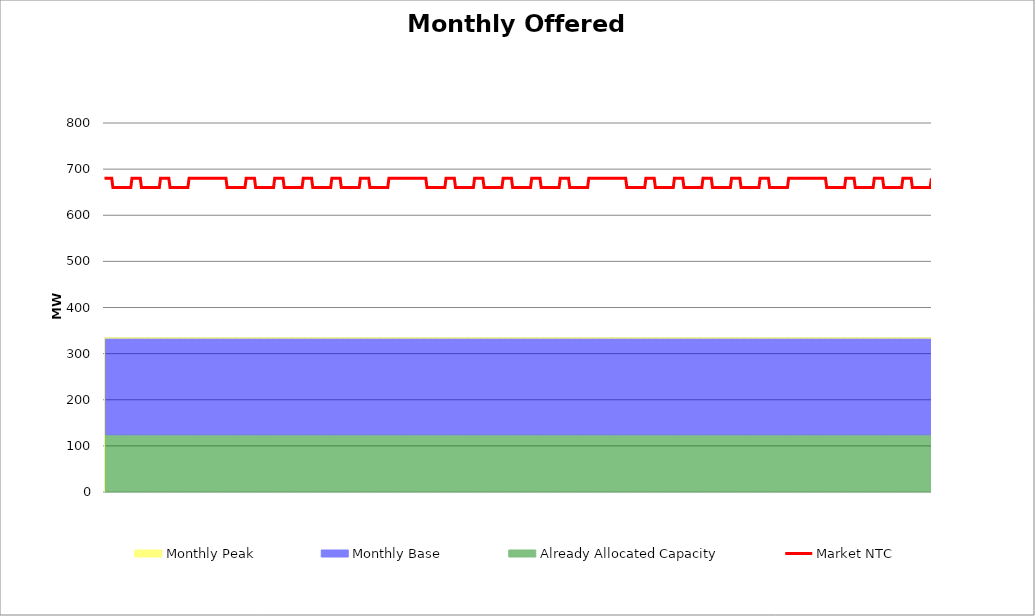
| Category | Market NTC |
|---|---|
| 0 | 680 |
| 1 | 680 |
| 2 | 680 |
| 3 | 680 |
| 4 | 680 |
| 5 | 680 |
| 6 | 680 |
| 7 | 660 |
| 8 | 660 |
| 9 | 660 |
| 10 | 660 |
| 11 | 660 |
| 12 | 660 |
| 13 | 660 |
| 14 | 660 |
| 15 | 660 |
| 16 | 660 |
| 17 | 660 |
| 18 | 660 |
| 19 | 660 |
| 20 | 660 |
| 21 | 660 |
| 22 | 660 |
| 23 | 680 |
| 24 | 680 |
| 25 | 680 |
| 26 | 680 |
| 27 | 680 |
| 28 | 680 |
| 29 | 680 |
| 30 | 680 |
| 31 | 660 |
| 32 | 660 |
| 33 | 660 |
| 34 | 660 |
| 35 | 660 |
| 36 | 660 |
| 37 | 660 |
| 38 | 660 |
| 39 | 660 |
| 40 | 660 |
| 41 | 660 |
| 42 | 660 |
| 43 | 660 |
| 44 | 660 |
| 45 | 660 |
| 46 | 660 |
| 47 | 680 |
| 48 | 680 |
| 49 | 680 |
| 50 | 680 |
| 51 | 680 |
| 52 | 680 |
| 53 | 680 |
| 54 | 680 |
| 55 | 660 |
| 56 | 660 |
| 57 | 660 |
| 58 | 660 |
| 59 | 660 |
| 60 | 660 |
| 61 | 660 |
| 62 | 660 |
| 63 | 660 |
| 64 | 660 |
| 65 | 660 |
| 66 | 660 |
| 67 | 660 |
| 68 | 660 |
| 69 | 660 |
| 70 | 660 |
| 71 | 680 |
| 72 | 680 |
| 73 | 680 |
| 74 | 680 |
| 75 | 680 |
| 76 | 680 |
| 77 | 680 |
| 78 | 680 |
| 79 | 680 |
| 80 | 680 |
| 81 | 680 |
| 82 | 680 |
| 83 | 680 |
| 84 | 680 |
| 85 | 680 |
| 86 | 680 |
| 87 | 680 |
| 88 | 680 |
| 89 | 680 |
| 90 | 680 |
| 91 | 680 |
| 92 | 680 |
| 93 | 680 |
| 94 | 680 |
| 95 | 680 |
| 96 | 680 |
| 97 | 680 |
| 98 | 680 |
| 99 | 680 |
| 100 | 680 |
| 101 | 680 |
| 102 | 680 |
| 103 | 660 |
| 104 | 660 |
| 105 | 660 |
| 106 | 660 |
| 107 | 660 |
| 108 | 660 |
| 109 | 660 |
| 110 | 660 |
| 111 | 660 |
| 112 | 660 |
| 113 | 660 |
| 114 | 660 |
| 115 | 660 |
| 116 | 660 |
| 117 | 660 |
| 118 | 660 |
| 119 | 680 |
| 120 | 680 |
| 121 | 680 |
| 122 | 680 |
| 123 | 680 |
| 124 | 680 |
| 125 | 680 |
| 126 | 680 |
| 127 | 660 |
| 128 | 660 |
| 129 | 660 |
| 130 | 660 |
| 131 | 660 |
| 132 | 660 |
| 133 | 660 |
| 134 | 660 |
| 135 | 660 |
| 136 | 660 |
| 137 | 660 |
| 138 | 660 |
| 139 | 660 |
| 140 | 660 |
| 141 | 660 |
| 142 | 660 |
| 143 | 680 |
| 144 | 680 |
| 145 | 680 |
| 146 | 680 |
| 147 | 680 |
| 148 | 680 |
| 149 | 680 |
| 150 | 680 |
| 151 | 660 |
| 152 | 660 |
| 153 | 660 |
| 154 | 660 |
| 155 | 660 |
| 156 | 660 |
| 157 | 660 |
| 158 | 660 |
| 159 | 660 |
| 160 | 660 |
| 161 | 660 |
| 162 | 660 |
| 163 | 660 |
| 164 | 660 |
| 165 | 660 |
| 166 | 660 |
| 167 | 680 |
| 168 | 680 |
| 169 | 680 |
| 170 | 680 |
| 171 | 680 |
| 172 | 680 |
| 173 | 680 |
| 174 | 680 |
| 175 | 660 |
| 176 | 660 |
| 177 | 660 |
| 178 | 660 |
| 179 | 660 |
| 180 | 660 |
| 181 | 660 |
| 182 | 660 |
| 183 | 660 |
| 184 | 660 |
| 185 | 660 |
| 186 | 660 |
| 187 | 660 |
| 188 | 660 |
| 189 | 660 |
| 190 | 660 |
| 191 | 680 |
| 192 | 680 |
| 193 | 680 |
| 194 | 680 |
| 195 | 680 |
| 196 | 680 |
| 197 | 680 |
| 198 | 680 |
| 199 | 660 |
| 200 | 660 |
| 201 | 660 |
| 202 | 660 |
| 203 | 660 |
| 204 | 660 |
| 205 | 660 |
| 206 | 660 |
| 207 | 660 |
| 208 | 660 |
| 209 | 660 |
| 210 | 660 |
| 211 | 660 |
| 212 | 660 |
| 213 | 660 |
| 214 | 660 |
| 215 | 680 |
| 216 | 680 |
| 217 | 680 |
| 218 | 680 |
| 219 | 680 |
| 220 | 680 |
| 221 | 680 |
| 222 | 680 |
| 223 | 660 |
| 224 | 660 |
| 225 | 660 |
| 226 | 660 |
| 227 | 660 |
| 228 | 660 |
| 229 | 660 |
| 230 | 660 |
| 231 | 660 |
| 232 | 660 |
| 233 | 660 |
| 234 | 660 |
| 235 | 660 |
| 236 | 660 |
| 237 | 660 |
| 238 | 660 |
| 239 | 680 |
| 240 | 680 |
| 241 | 680 |
| 242 | 680 |
| 243 | 680 |
| 244 | 680 |
| 245 | 680 |
| 246 | 680 |
| 247 | 680 |
| 248 | 680 |
| 249 | 680 |
| 250 | 680 |
| 251 | 680 |
| 252 | 680 |
| 253 | 680 |
| 254 | 680 |
| 255 | 680 |
| 256 | 680 |
| 257 | 680 |
| 258 | 680 |
| 259 | 680 |
| 260 | 680 |
| 261 | 680 |
| 262 | 680 |
| 263 | 680 |
| 264 | 680 |
| 265 | 680 |
| 266 | 680 |
| 267 | 680 |
| 268 | 680 |
| 269 | 680 |
| 270 | 680 |
| 271 | 660 |
| 272 | 660 |
| 273 | 660 |
| 274 | 660 |
| 275 | 660 |
| 276 | 660 |
| 277 | 660 |
| 278 | 660 |
| 279 | 660 |
| 280 | 660 |
| 281 | 660 |
| 282 | 660 |
| 283 | 660 |
| 284 | 660 |
| 285 | 660 |
| 286 | 660 |
| 287 | 680 |
| 288 | 680 |
| 289 | 680 |
| 290 | 680 |
| 291 | 680 |
| 292 | 680 |
| 293 | 680 |
| 294 | 680 |
| 295 | 660 |
| 296 | 660 |
| 297 | 660 |
| 298 | 660 |
| 299 | 660 |
| 300 | 660 |
| 301 | 660 |
| 302 | 660 |
| 303 | 660 |
| 304 | 660 |
| 305 | 660 |
| 306 | 660 |
| 307 | 660 |
| 308 | 660 |
| 309 | 660 |
| 310 | 660 |
| 311 | 680 |
| 312 | 680 |
| 313 | 680 |
| 314 | 680 |
| 315 | 680 |
| 316 | 680 |
| 317 | 680 |
| 318 | 680 |
| 319 | 660 |
| 320 | 660 |
| 321 | 660 |
| 322 | 660 |
| 323 | 660 |
| 324 | 660 |
| 325 | 660 |
| 326 | 660 |
| 327 | 660 |
| 328 | 660 |
| 329 | 660 |
| 330 | 660 |
| 331 | 660 |
| 332 | 660 |
| 333 | 660 |
| 334 | 660 |
| 335 | 680 |
| 336 | 680 |
| 337 | 680 |
| 338 | 680 |
| 339 | 680 |
| 340 | 680 |
| 341 | 680 |
| 342 | 680 |
| 343 | 660 |
| 344 | 660 |
| 345 | 660 |
| 346 | 660 |
| 347 | 660 |
| 348 | 660 |
| 349 | 660 |
| 350 | 660 |
| 351 | 660 |
| 352 | 660 |
| 353 | 660 |
| 354 | 660 |
| 355 | 660 |
| 356 | 660 |
| 357 | 660 |
| 358 | 660 |
| 359 | 680 |
| 360 | 680 |
| 361 | 680 |
| 362 | 680 |
| 363 | 680 |
| 364 | 680 |
| 365 | 680 |
| 366 | 680 |
| 367 | 660 |
| 368 | 660 |
| 369 | 660 |
| 370 | 660 |
| 371 | 660 |
| 372 | 660 |
| 373 | 660 |
| 374 | 660 |
| 375 | 660 |
| 376 | 660 |
| 377 | 660 |
| 378 | 660 |
| 379 | 660 |
| 380 | 660 |
| 381 | 660 |
| 382 | 660 |
| 383 | 680 |
| 384 | 680 |
| 385 | 680 |
| 386 | 680 |
| 387 | 680 |
| 388 | 680 |
| 389 | 680 |
| 390 | 680 |
| 391 | 660 |
| 392 | 660 |
| 393 | 660 |
| 394 | 660 |
| 395 | 660 |
| 396 | 660 |
| 397 | 660 |
| 398 | 660 |
| 399 | 660 |
| 400 | 660 |
| 401 | 660 |
| 402 | 660 |
| 403 | 660 |
| 404 | 660 |
| 405 | 660 |
| 406 | 660 |
| 407 | 680 |
| 408 | 680 |
| 409 | 680 |
| 410 | 680 |
| 411 | 680 |
| 412 | 680 |
| 413 | 680 |
| 414 | 680 |
| 415 | 680 |
| 416 | 680 |
| 417 | 680 |
| 418 | 680 |
| 419 | 680 |
| 420 | 680 |
| 421 | 680 |
| 422 | 680 |
| 423 | 680 |
| 424 | 680 |
| 425 | 680 |
| 426 | 680 |
| 427 | 680 |
| 428 | 680 |
| 429 | 680 |
| 430 | 680 |
| 431 | 680 |
| 432 | 680 |
| 433 | 680 |
| 434 | 680 |
| 435 | 680 |
| 436 | 680 |
| 437 | 680 |
| 438 | 680 |
| 439 | 660 |
| 440 | 660 |
| 441 | 660 |
| 442 | 660 |
| 443 | 660 |
| 444 | 660 |
| 445 | 660 |
| 446 | 660 |
| 447 | 660 |
| 448 | 660 |
| 449 | 660 |
| 450 | 660 |
| 451 | 660 |
| 452 | 660 |
| 453 | 660 |
| 454 | 660 |
| 455 | 680 |
| 456 | 680 |
| 457 | 680 |
| 458 | 680 |
| 459 | 680 |
| 460 | 680 |
| 461 | 680 |
| 462 | 680 |
| 463 | 660 |
| 464 | 660 |
| 465 | 660 |
| 466 | 660 |
| 467 | 660 |
| 468 | 660 |
| 469 | 660 |
| 470 | 660 |
| 471 | 660 |
| 472 | 660 |
| 473 | 660 |
| 474 | 660 |
| 475 | 660 |
| 476 | 660 |
| 477 | 660 |
| 478 | 660 |
| 479 | 680 |
| 480 | 680 |
| 481 | 680 |
| 482 | 680 |
| 483 | 680 |
| 484 | 680 |
| 485 | 680 |
| 486 | 680 |
| 487 | 660 |
| 488 | 660 |
| 489 | 660 |
| 490 | 660 |
| 491 | 660 |
| 492 | 660 |
| 493 | 660 |
| 494 | 660 |
| 495 | 660 |
| 496 | 660 |
| 497 | 660 |
| 498 | 660 |
| 499 | 660 |
| 500 | 660 |
| 501 | 660 |
| 502 | 660 |
| 503 | 680 |
| 504 | 680 |
| 505 | 680 |
| 506 | 680 |
| 507 | 680 |
| 508 | 680 |
| 509 | 680 |
| 510 | 680 |
| 511 | 660 |
| 512 | 660 |
| 513 | 660 |
| 514 | 660 |
| 515 | 660 |
| 516 | 660 |
| 517 | 660 |
| 518 | 660 |
| 519 | 660 |
| 520 | 660 |
| 521 | 660 |
| 522 | 660 |
| 523 | 660 |
| 524 | 660 |
| 525 | 660 |
| 526 | 660 |
| 527 | 680 |
| 528 | 680 |
| 529 | 680 |
| 530 | 680 |
| 531 | 680 |
| 532 | 680 |
| 533 | 680 |
| 534 | 680 |
| 535 | 660 |
| 536 | 660 |
| 537 | 660 |
| 538 | 660 |
| 539 | 660 |
| 540 | 660 |
| 541 | 660 |
| 542 | 660 |
| 543 | 660 |
| 544 | 660 |
| 545 | 660 |
| 546 | 660 |
| 547 | 660 |
| 548 | 660 |
| 549 | 660 |
| 550 | 660 |
| 551 | 680 |
| 552 | 680 |
| 553 | 680 |
| 554 | 680 |
| 555 | 680 |
| 556 | 680 |
| 557 | 680 |
| 558 | 680 |
| 559 | 660 |
| 560 | 660 |
| 561 | 660 |
| 562 | 660 |
| 563 | 660 |
| 564 | 660 |
| 565 | 660 |
| 566 | 660 |
| 567 | 660 |
| 568 | 660 |
| 569 | 660 |
| 570 | 660 |
| 571 | 660 |
| 572 | 660 |
| 573 | 660 |
| 574 | 660 |
| 575 | 680 |
| 576 | 680 |
| 577 | 680 |
| 578 | 680 |
| 579 | 680 |
| 580 | 680 |
| 581 | 680 |
| 582 | 680 |
| 583 | 680 |
| 584 | 680 |
| 585 | 680 |
| 586 | 680 |
| 587 | 680 |
| 588 | 680 |
| 589 | 680 |
| 590 | 680 |
| 591 | 680 |
| 592 | 680 |
| 593 | 680 |
| 594 | 680 |
| 595 | 680 |
| 596 | 680 |
| 597 | 680 |
| 598 | 680 |
| 599 | 680 |
| 600 | 680 |
| 601 | 680 |
| 602 | 680 |
| 603 | 680 |
| 604 | 680 |
| 605 | 680 |
| 606 | 680 |
| 607 | 660 |
| 608 | 660 |
| 609 | 660 |
| 610 | 660 |
| 611 | 660 |
| 612 | 660 |
| 613 | 660 |
| 614 | 660 |
| 615 | 660 |
| 616 | 660 |
| 617 | 660 |
| 618 | 660 |
| 619 | 660 |
| 620 | 660 |
| 621 | 660 |
| 622 | 660 |
| 623 | 680 |
| 624 | 680 |
| 625 | 680 |
| 626 | 680 |
| 627 | 680 |
| 628 | 680 |
| 629 | 680 |
| 630 | 680 |
| 631 | 660 |
| 632 | 660 |
| 633 | 660 |
| 634 | 660 |
| 635 | 660 |
| 636 | 660 |
| 637 | 660 |
| 638 | 660 |
| 639 | 660 |
| 640 | 660 |
| 641 | 660 |
| 642 | 660 |
| 643 | 660 |
| 644 | 660 |
| 645 | 660 |
| 646 | 660 |
| 647 | 680 |
| 648 | 680 |
| 649 | 680 |
| 650 | 680 |
| 651 | 680 |
| 652 | 680 |
| 653 | 680 |
| 654 | 680 |
| 655 | 660 |
| 656 | 660 |
| 657 | 660 |
| 658 | 660 |
| 659 | 660 |
| 660 | 660 |
| 661 | 660 |
| 662 | 660 |
| 663 | 660 |
| 664 | 660 |
| 665 | 660 |
| 666 | 660 |
| 667 | 660 |
| 668 | 660 |
| 669 | 660 |
| 670 | 660 |
| 671 | 680 |
| 672 | 680 |
| 673 | 680 |
| 674 | 680 |
| 675 | 680 |
| 676 | 680 |
| 677 | 680 |
| 678 | 680 |
| 679 | 660 |
| 680 | 660 |
| 681 | 660 |
| 682 | 660 |
| 683 | 660 |
| 684 | 660 |
| 685 | 660 |
| 686 | 660 |
| 687 | 660 |
| 688 | 660 |
| 689 | 660 |
| 690 | 660 |
| 691 | 660 |
| 692 | 660 |
| 693 | 660 |
| 694 | 660 |
| 695 | 680 |